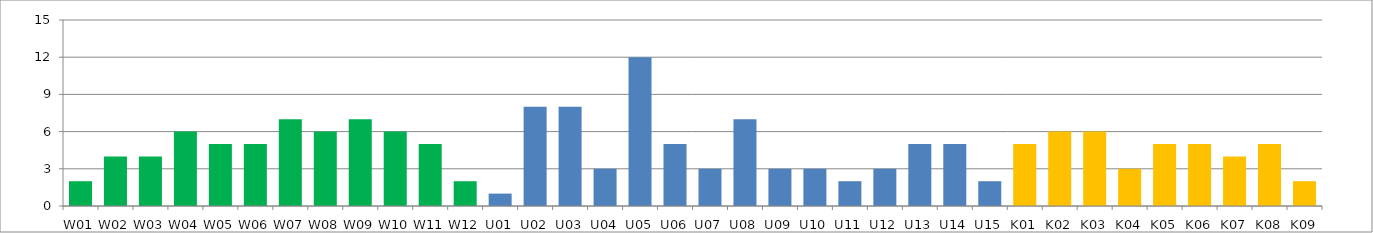
| Category | Series 0 |
|---|---|
| W01 | 2 |
| W02 | 4 |
| W03 | 4 |
| W04 | 6 |
| W05 | 5 |
| W06 | 5 |
| W07 | 7 |
| W08 | 6 |
| W09 | 7 |
| W10 | 6 |
| W11 | 5 |
| W12 | 2 |
| U01 | 1 |
| U02 | 8 |
| U03 | 8 |
| U04 | 3 |
| U05 | 12 |
| U06 | 5 |
| U07 | 3 |
| U08 | 7 |
| U09 | 3 |
| U10 | 3 |
| U11 | 2 |
| U12 | 3 |
| U13 | 5 |
| U14 | 5 |
| U15 | 2 |
| K01 | 5 |
| K02 | 6 |
| K03 | 6 |
| K04 | 3 |
| K05 | 5 |
| K06 | 5 |
| K07 | 4 |
| K08 | 5 |
| K09 | 2 |